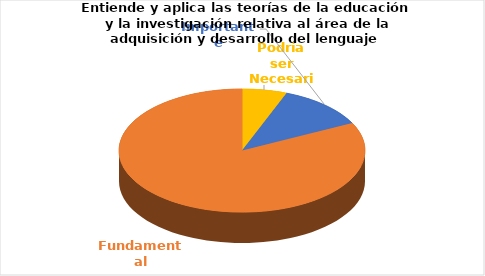
| Category | Series 0 |
|---|---|
| Podría ser Necesaria | 1 |
| Importante | 2 |
| Fundamental | 14 |